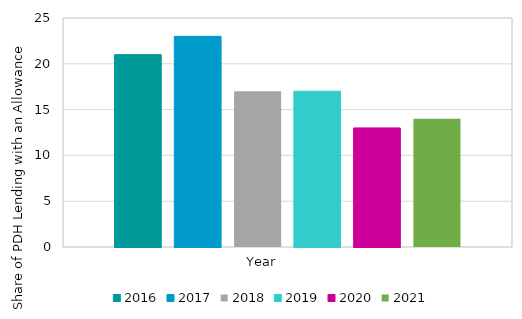
| Category | 2016 | 2017 | 2018 | 2019 | 2020 | 2021 |
|---|---|---|---|---|---|---|
| Share of PDH Lending with an allowance by Value (%) | 21 | 23 | 17 | 17 | 13 | 14 |